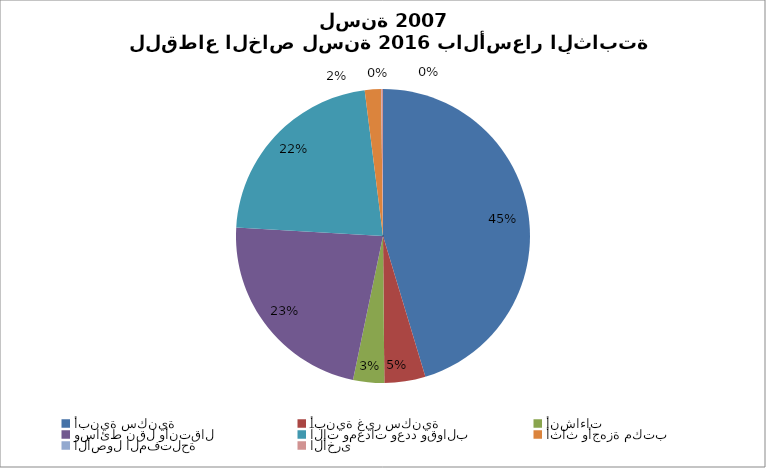
| Category | Series 0 |
|---|---|
| أبنية سكنية | 20335.58 |
| أبنية غير سكنية | 2021.408 |
| أنشاءات | 1534.871 |
| وسائط نقل وأنتقال | 10152.864 |
| آلات ومعدات وعدد وقوالب | 9908.097 |
| أثاث وأجهزة مكتب | 798.215 |
| الأصول المفتلحة | 11.456 |
| الأخرى  | 82.968 |